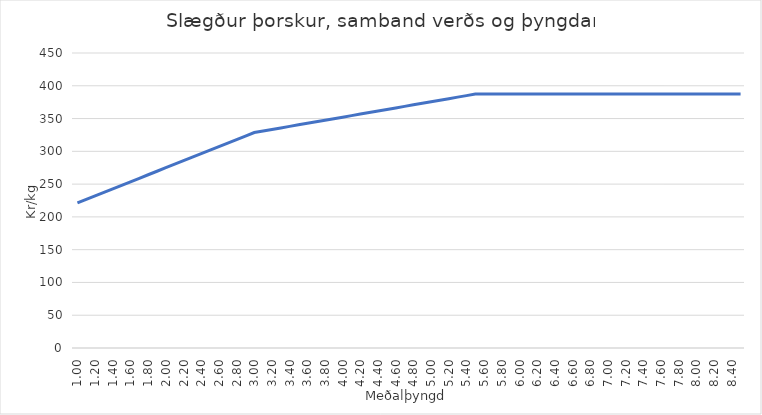
| Category | Series 0 |
|---|---|
| 1.0 | 221.344 |
| 1.1 | 226.71 |
| 1.2 | 232.076 |
| 1.3 | 237.442 |
| 1.4 | 242.808 |
| 1.5 | 248.174 |
| 1.6 | 253.54 |
| 1.7 | 258.906 |
| 1.8 | 264.272 |
| 1.9 | 269.638 |
| 2.0 | 275.004 |
| 2.1 | 280.37 |
| 2.2 | 285.736 |
| 2.3 | 291.102 |
| 2.4 | 296.467 |
| 2.5 | 301.833 |
| 2.6 | 307.199 |
| 2.7 | 312.565 |
| 2.8 | 317.931 |
| 2.9 | 323.297 |
| 3.0 | 328.663 |
| 3.1 | 331.011 |
| 3.2 | 333.358 |
| 3.3 | 335.706 |
| 3.4 | 338.054 |
| 3.5 | 340.401 |
| 3.6 | 342.749 |
| 3.7 | 345.097 |
| 3.8 | 347.444 |
| 3.9 | 349.792 |
| 4.0 | 352.14 |
| 4.1 | 354.487 |
| 4.2 | 356.835 |
| 4.3 | 359.183 |
| 4.4 | 361.531 |
| 4.5 | 363.878 |
| 4.6 | 366.226 |
| 4.7 | 368.574 |
| 4.8 | 370.921 |
| 4.9 | 373.269 |
| 5.0 | 375.617 |
| 5.1 | 377.964 |
| 5.2 | 380.312 |
| 5.3 | 382.66 |
| 5.4 | 385.007 |
| 5.5 | 387.355 |
| 5.6 | 387.355 |
| 5.7 | 387.355 |
| 5.8 | 387.355 |
| 5.9 | 387.355 |
| 6.0 | 387.355 |
| 6.1 | 387.355 |
| 6.2 | 387.355 |
| 6.3 | 387.355 |
| 6.4 | 387.355 |
| 6.50000000000001 | 387.355 |
| 6.6 | 387.355 |
| 6.7 | 387.355 |
| 6.80000000000001 | 387.355 |
| 6.90000000000001 | 387.355 |
| 7.00000000000001 | 387.355 |
| 7.100000000000009 | 387.355 |
| 7.200000000000009 | 387.355 |
| 7.300000000000009 | 387.355 |
| 7.400000000000008 | 387.355 |
| 7.500000000000008 | 387.355 |
| 7.600000000000008 | 387.355 |
| 7.700000000000007 | 387.355 |
| 7.800000000000007 | 387.355 |
| 7.900000000000007 | 387.355 |
| 8.000000000000007 | 387.355 |
| 8.100000000000007 | 387.355 |
| 8.200000000000006 | 387.355 |
| 8.300000000000006 | 387.355 |
| 8.400000000000006 | 387.355 |
| 8.500000000000005 | 387.355 |